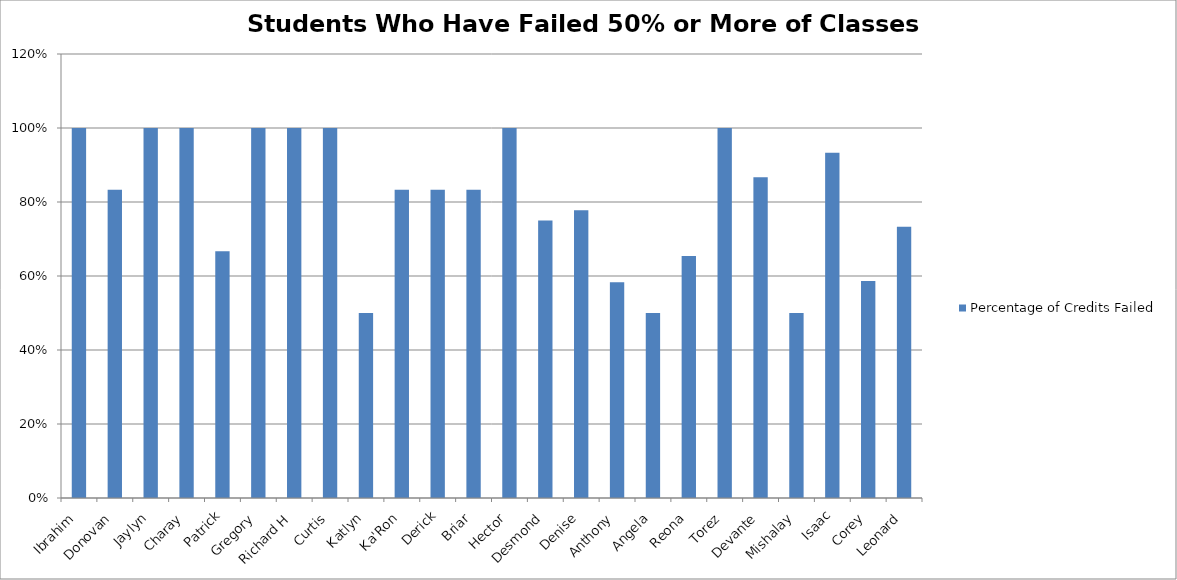
| Category | Percentage of Credits Failed |
|---|---|
| Ibrahim | 1 |
| Donovan | 0.833 |
| Jaylyn | 1 |
| Charay | 1 |
| Patrick | 0.667 |
| Gregory | 1 |
| Richard H | 1 |
| Curtis | 1 |
| Katlyn | 0.5 |
| Ka'Ron | 0.833 |
| Derick | 0.833 |
| Briar | 0.833 |
| Hector | 1 |
| Desmond | 0.75 |
| Denise | 0.778 |
| Anthony | 0.583 |
| Angela | 0.5 |
| Reona | 0.654 |
| Torez | 1 |
| Devante | 0.867 |
| Mishalay | 0.5 |
| Isaac | 0.933 |
| Corey | 0.586 |
| Leonard | 0.733 |